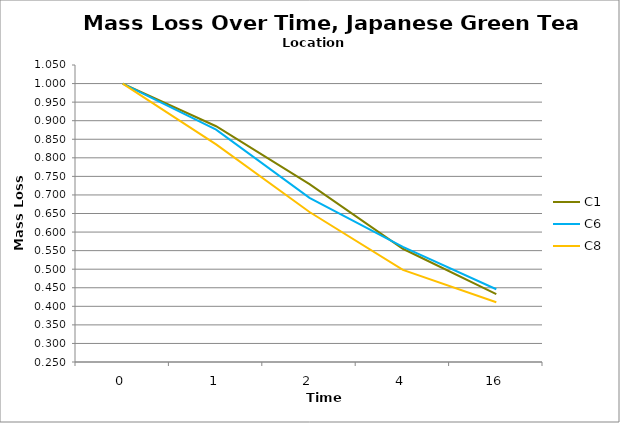
| Category | C1 | C6 | C8 |
|---|---|---|---|
| 0.0 | 1 | 1 | 1 |
| 1.0 | 0.885 | 0.876 | 0.836 |
| 2.0 | 0.729 | 0.692 | 0.654 |
| 4.0 | 0.555 | 0.56 | 0.498 |
| 16.0 | 0.433 | 0.446 | 0.411 |